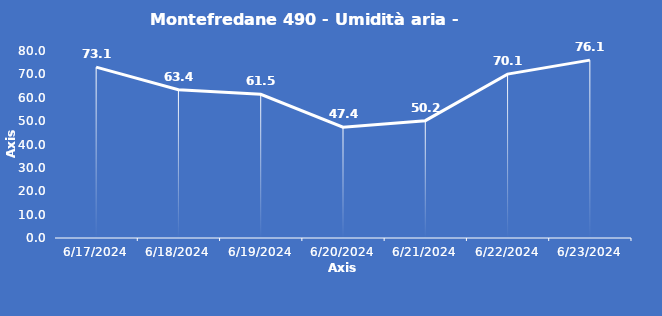
| Category | Montefredane 490 - Umidità aria - Grezzo (%) |
|---|---|
| 6/17/24 | 73.1 |
| 6/18/24 | 63.4 |
| 6/19/24 | 61.5 |
| 6/20/24 | 47.4 |
| 6/21/24 | 50.2 |
| 6/22/24 | 70.1 |
| 6/23/24 | 76.1 |